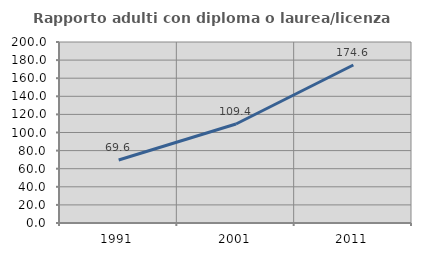
| Category | Rapporto adulti con diploma o laurea/licenza media  |
|---|---|
| 1991.0 | 69.642 |
| 2001.0 | 109.421 |
| 2011.0 | 174.573 |